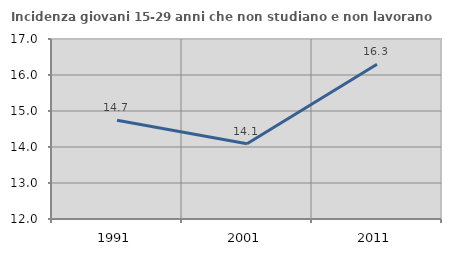
| Category | Incidenza giovani 15-29 anni che non studiano e non lavorano  |
|---|---|
| 1991.0 | 14.745 |
| 2001.0 | 14.091 |
| 2011.0 | 16.3 |